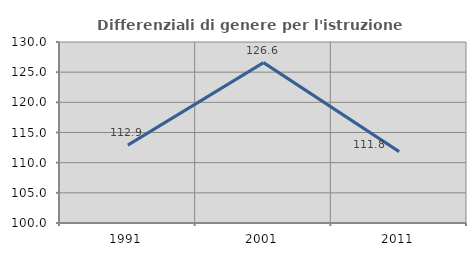
| Category | Differenziali di genere per l'istruzione superiore |
|---|---|
| 1991.0 | 112.906 |
| 2001.0 | 126.582 |
| 2011.0 | 111.831 |